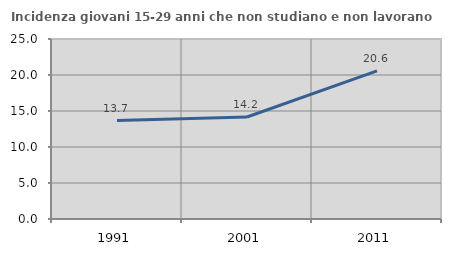
| Category | Incidenza giovani 15-29 anni che non studiano e non lavorano  |
|---|---|
| 1991.0 | 13.669 |
| 2001.0 | 14.162 |
| 2011.0 | 20.569 |